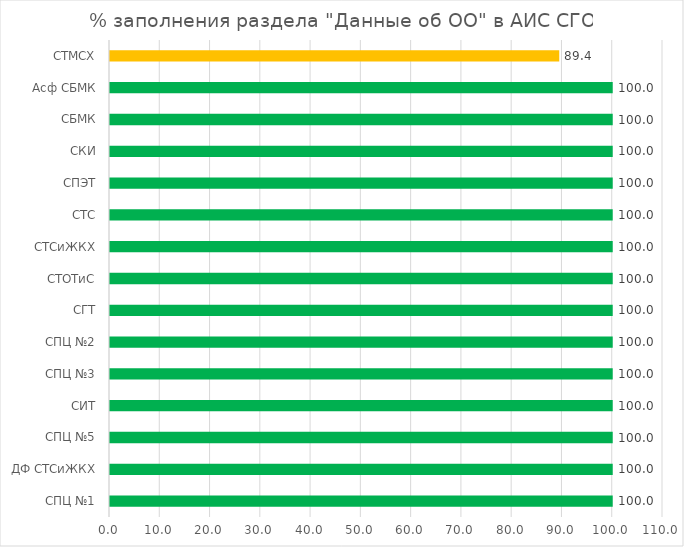
| Category | Series 0 |
|---|---|
| СПЦ №1 | 100 |
| ДФ СТСиЖКХ | 100 |
| СПЦ №5 | 100 |
| СИТ | 100 |
| СПЦ №3 | 100 |
| СПЦ №2 | 100 |
| СГТ | 100 |
| СТОТиС | 100 |
| СТСиЖКХ | 100 |
| СТС | 100 |
| СПЭТ | 100 |
| СКИ | 100 |
| СБМК | 100 |
| Асф СБМК | 100 |
| СТМСХ | 89.362 |